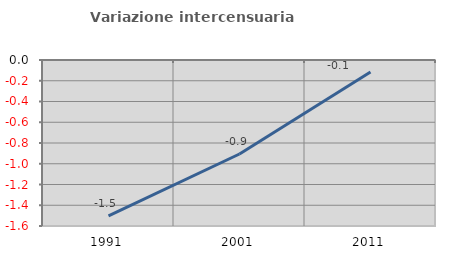
| Category | Variazione intercensuaria annua |
|---|---|
| 1991.0 | -1.503 |
| 2001.0 | -0.906 |
| 2011.0 | -0.116 |